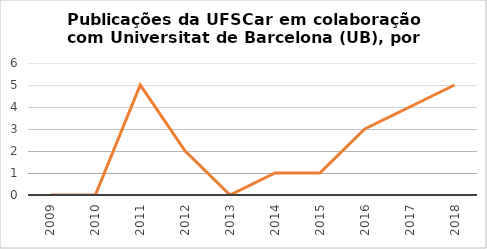
| Category | # Records |
|---|---|
| 2018.0 | 5 |
| 2017.0 | 4 |
| 2016.0 | 3 |
| 2015.0 | 1 |
| 2014.0 | 1 |
| 2013.0 | 0 |
| 2012.0 | 2 |
| 2011.0 | 5 |
| 2010.0 | 0 |
| 2009.0 | 0 |